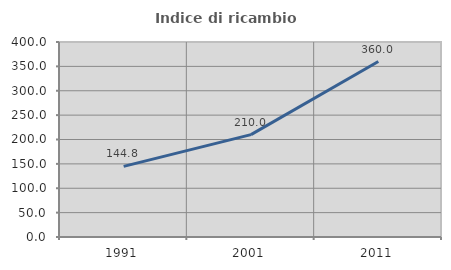
| Category | Indice di ricambio occupazionale  |
|---|---|
| 1991.0 | 144.828 |
| 2001.0 | 210 |
| 2011.0 | 360 |